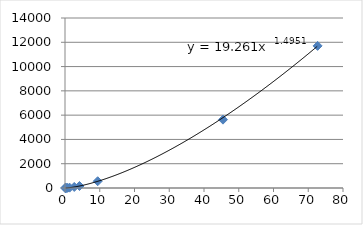
| Category | Series 0 |
|---|---|
| 0.0536566107417626 | 0.241 |
| 0.100263344331512 | 0.615 |
| 0.138612455520812 | 1 |
| 0.211205372544021 | 1.881 |
| 0.383694707266637 | 4.599 |
| 0.721184105157027 | 11.86 |
| 1.3219330406089 | 29.442 |
| 2.65989568912593 | 84.045 |
| 4.16806868288713 | 164.862 |
| 9.40650748458789 | 556.399 |
| 45.4654347723599 | 5629.255 |
| 72.689175745264 | 11704.333 |